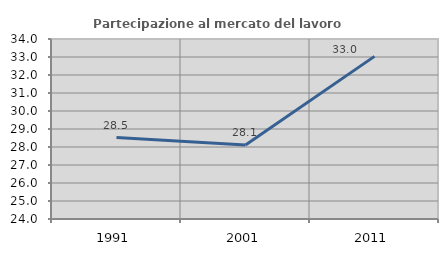
| Category | Partecipazione al mercato del lavoro  femminile |
|---|---|
| 1991.0 | 28.526 |
| 2001.0 | 28.112 |
| 2011.0 | 33.035 |